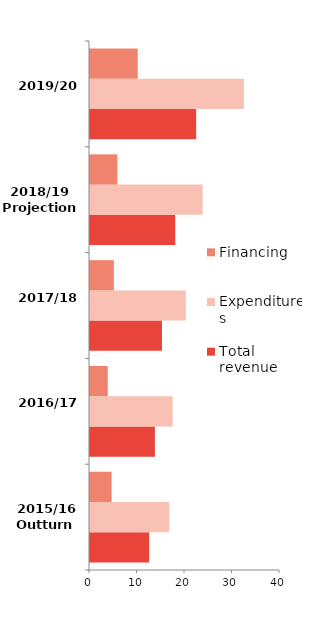
| Category | Total revenue   | Expenditures   | Financing |
|---|---|---|---|
| 0 | 12456 | 16693 | 4550 |
| 1 | 13661 | 17402 | 3742 |
| 2 | 15150 | 20169 | 5019 |
| 3 | 17949 | 23718 | 5769 |
| 4 | 22350 | 32401 | 10051 |